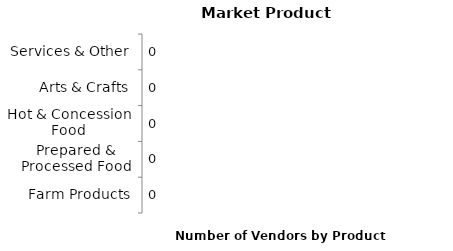
| Category | Series 0 |
|---|---|
| Farm Products | 0 |
| Prepared & Processed Food | 0 |
| Hot & Concession Food | 0 |
| Arts & Crafts | 0 |
| Services & Other | 0 |